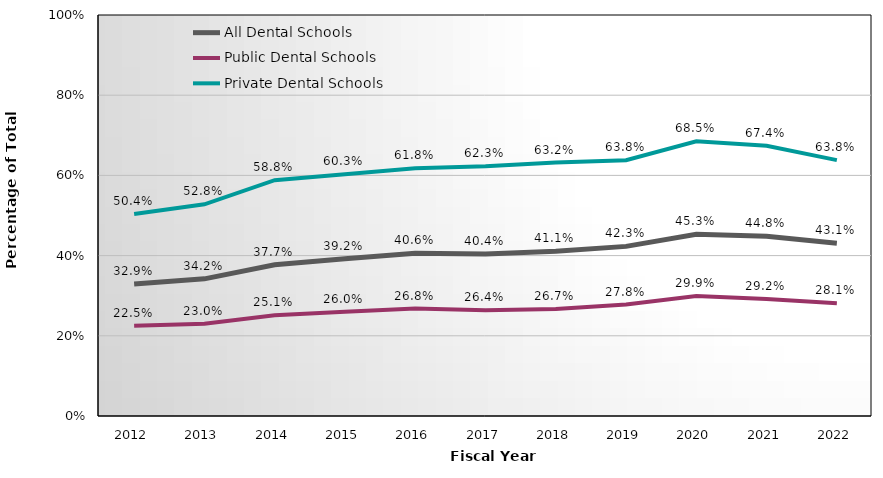
| Category | All Dental Schools | Public Dental Schools | Private Dental Schools |
|---|---|---|---|
| 2012.0 | 0.329 | 0.225 | 0.504 |
| 2013.0 | 0.342 | 0.23 | 0.528 |
| 2014.0 | 0.377 | 0.251 | 0.588 |
| 2015.0 | 0.392 | 0.26 | 0.603 |
| 2016.0 | 0.406 | 0.268 | 0.618 |
| 2017.0 | 0.404 | 0.264 | 0.623 |
| 2018.0 | 0.411 | 0.267 | 0.632 |
| 2019.0 | 0.423 | 0.278 | 0.638 |
| 2020.0 | 0.453 | 0.299 | 0.685 |
| 2021.0 | 0.448 | 0.292 | 0.674 |
| 2022.0 | 0.431 | 0.281 | 0.638 |